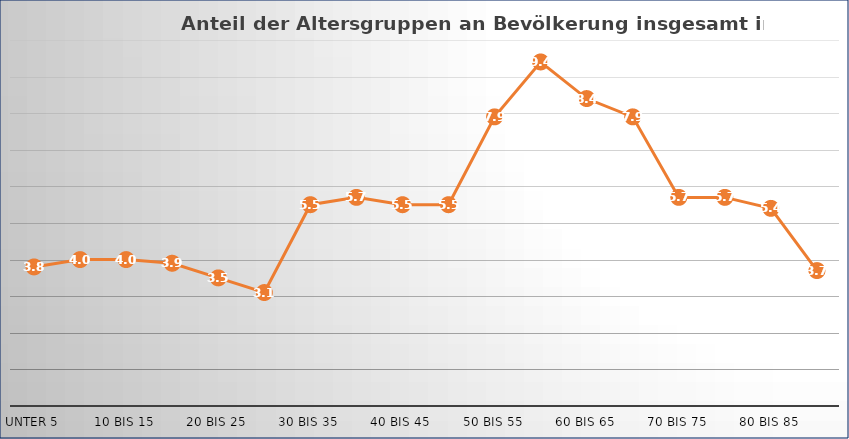
| Category | Series 1 |
|---|---|
| unter 5 | 3.8 |
| 5 bis 10 | 4 |
| 10 bis 15 | 4 |
| 15 bis 20 | 3.9 |
| 20 bis 25 | 3.5 |
| 25 bis 30 | 3.1 |
| 30 bis 35 | 5.5 |
| 35 bis 40 | 5.7 |
| 40 bis 45 | 5.5 |
| 45 bis 50 | 5.5 |
| 50 bis 55 | 7.9 |
| 55 bis 60 | 9.4 |
| 60 bis 65 | 8.4 |
| 65 bis 70 | 7.9 |
| 70 bis 75 | 5.7 |
| 75 bis 80 | 5.7 |
| 80 bis 85 | 5.4 |
| 85 und mehr | 3.7 |